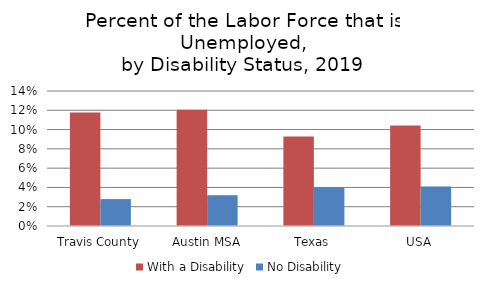
| Category | With a Disability | No Disability |
|---|---|---|
| Travis County | 0.118 | 0.028 |
| Austin MSA | 0.121 | 0.032 |
| Texas | 0.093 | 0.04 |
| USA | 0.104 | 0.041 |